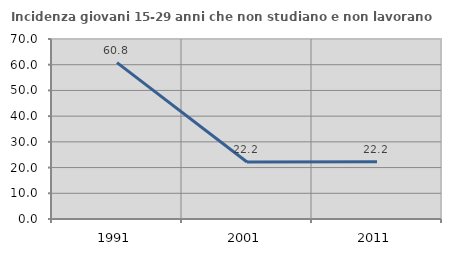
| Category | Incidenza giovani 15-29 anni che non studiano e non lavorano  |
|---|---|
| 1991.0 | 60.792 |
| 2001.0 | 22.154 |
| 2011.0 | 22.222 |